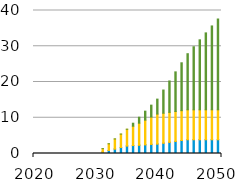
| Category | natural gas | resid | solar | wind |
|---|---|---|---|---|
| 2020.0 | 0 | 0 | 0 | 0 |
| 2021.0 | 0 | 0 | 0 | 0 |
| 2022.0 | 0 | 0 | 0 | 0 |
| 2023.0 | 0 | 0 | 0 | 0 |
| 2024.0 | 0 | 0 | 0 | 0 |
| 2025.0 | 0 | 0 | 0 | 0 |
| 2026.0 | 0 | 0 | 0 | 0 |
| 2027.0 | 0 | 0 | 0 | 0 |
| 2028.0 | 0 | 0 | 0 | 0 |
| 2029.0 | 0 | 0 | 0 | 0 |
| 2030.0 | 0 | 0 | 0 | 0 |
| 2031.0 | 0.423 | 0 | 0.934 | 0 |
| 2032.0 | 0.847 | 0.001 | 1.867 | 0 |
| 2033.0 | 1.27 | 0.001 | 2.801 | 0 |
| 2034.0 | 1.693 | 0.001 | 3.735 | 0 |
| 2035.0 | 2.117 | 0.002 | 4.668 | 0 |
| 2036.0 | 2.228 | 0.002 | 5.405 | 0.838 |
| 2037.0 | 2.338 | 0.002 | 6.141 | 1.675 |
| 2038.0 | 2.449 | 0.002 | 6.877 | 2.513 |
| 2039.0 | 2.56 | 0.002 | 7.614 | 3.35 |
| 2040.0 | 2.67 | 0.002 | 8.35 | 4.188 |
| 2041.0 | 2.91 | 0.002 | 8.35 | 6.489 |
| 2042.0 | 3.151 | 0.002 | 8.35 | 8.79 |
| 2043.0 | 3.391 | 0.002 | 8.35 | 11.091 |
| 2044.0 | 3.631 | 0.002 | 8.35 | 13.391 |
| 2045.0 | 3.871 | 0.002 | 8.35 | 15.692 |
| 2046.0 | 3.871 | 0.002 | 8.35 | 17.633 |
| 2047.0 | 3.871 | 0.002 | 8.35 | 19.574 |
| 2048.0 | 3.871 | 0.002 | 8.35 | 21.515 |
| 2049.0 | 3.871 | 0.002 | 8.35 | 23.456 |
| 2050.0 | 3.871 | 0.002 | 8.35 | 25.397 |